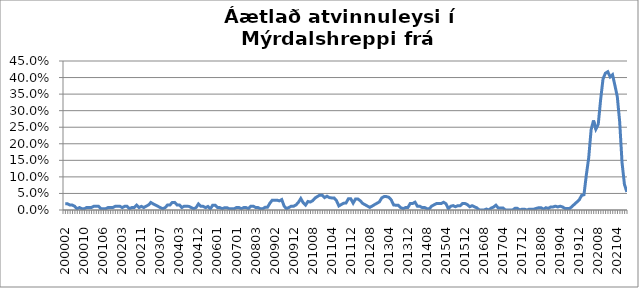
| Category | Series 0 |
|---|---|
| 200002 | 0.019 |
| 200003 | 0.019 |
| 200004 | 0.015 |
| 200005 | 0.015 |
| 200006 | 0.011 |
| 200007 | 0.004 |
| 200008 | 0.007 |
| 200009 | 0.004 |
| 200010 | 0.004 |
| 200011 | 0.007 |
| 200012 | 0.007 |
| 200101 | 0.007 |
| 200102 | 0.011 |
| 200103 | 0.011 |
| 200104 | 0.011 |
| 200105 | 0.004 |
| 200106 | 0.004 |
| 200108 | 0.004 |
| 200109 | 0.007 |
| 200110 | 0.007 |
| 200111 | 0.007 |
| 200112 | 0.011 |
| 200201 | 0.011 |
| 200202 | 0.011 |
| 200203 | 0.007 |
| 200204 | 0.011 |
| 200205 | 0.011 |
| 200206 | 0.004 |
| 200207 | 0.007 |
| 200208 | 0.007 |
| 200209 | 0.015 |
| 200210 | 0.007 |
| 200211 | 0.011 |
| 200212 | 0.007 |
| 200301 | 0.011 |
| 200302 | 0.015 |
| 200303 | 0.023 |
| 200304 | 0.018 |
| 200305 | 0.015 |
| 200306 | 0.011 |
| 200307 | 0.007 |
| 200308 | 0.004 |
| 200309 | 0.007 |
| 200310 | 0.015 |
| 200311 | 0.015 |
| 200312 | 0.023 |
| 200401 | 0.023 |
| 200402 | 0.015 |
| 200403 | 0.015 |
| 200404 | 0.008 |
| 200405 | 0.011 |
| 200406 | 0.011 |
| 200407 | 0.011 |
| 200408 | 0.007 |
| 200410 | 0.004 |
| 200411 | 0.007 |
| 200412 | 0.018 |
| 200501 | 0.011 |
| 200502 | 0.011 |
| 200508 | 0.007 |
| 200509 | 0.011 |
| 200510 | 0.004 |
| 200511 | 0.015 |
| 200512 | 0.015 |
| 200601 | 0.007 |
| 200602 | 0.007 |
| 200603 | 0.004 |
| 200604 | 0.007 |
| 200605 | 0.007 |
| 200606 | 0.003 |
| 200607 | 0.004 |
| 200612 | 0.004 |
| 200701 | 0.008 |
| 200702 | 0.008 |
| 200703 | 0.004 |
| 200704 | 0.007 |
| 200705 | 0.007 |
| 200712 | 0.004 |
| 200801 | 0.012 |
| 200802 | 0.012 |
| 200803 | 0.008 |
| 200804 | 0.007 |
| 200805 | 0.004 |
| 200806 | 0.004 |
| 200810 | 0.008 |
| 200811 | 0.008 |
| 200812 | 0.02 |
| 200901 | 0.03 |
| 200902 | 0.03 |
| 200903 | 0.03 |
| 200904 | 0.028 |
| 200905 | 0.031 |
| 200906 | 0.012 |
| 200907 | 0.004 |
| 200910 | 0.008 |
| 200911 | 0.011 |
| 200912 | 0.011 |
| 201001 | 0.015 |
| 201002 | 0.023 |
| 201003 | 0.035 |
| 201004 | 0.022 |
| 201005 | 0.015 |
| 201006 | 0.026 |
| 201007 | 0.024 |
| 201008 | 0.028 |
| 201009 | 0.036 |
| 201010 | 0.041 |
| 201011 | 0.045 |
| 201012 | 0.045 |
| 201101 | 0.038 |
| 201102 | 0.042 |
| 201103 | 0.038 |
| 201104 | 0.036 |
| 201105 | 0.036 |
| 201106 | 0.028 |
| 201107 | 0.012 |
| 201108 | 0.016 |
| 201109 | 0.02 |
| 201110 | 0.021 |
| 201111 | 0.034 |
| 201112 | 0.034 |
| 201201 | 0.021 |
| 201202 | 0.033 |
| 201203 | 0.033 |
| 201204 | 0.028 |
| 201205 | 0.02 |
| 201206 | 0.016 |
| 201207 | 0.012 |
| 201208 | 0.008 |
| 201209 | 0.012 |
| 201210 | 0.016 |
| 201211 | 0.02 |
| 201212 | 0.024 |
| 201301 | 0.036 |
| 201302 | 0.04 |
| 201303 | 0.04 |
| 201304 | 0.038 |
| 201305 | 0.031 |
| 201306 | 0.015 |
| 201307 | 0.014 |
| 201308 | 0.014 |
| 201309 | 0.007 |
| 201310 | 0.004 |
| 201311 | 0.007 |
| 201312 | 0.007 |
| 201401 | 0.02 |
| 201402 | 0.02 |
| 201403 | 0.024 |
| 201404 | 0.011 |
| 201405 | 0.011 |
| 201406 | 0.008 |
| 201407 | 0.008 |
| 201408 | 0.004 |
| 201409 | 0.004 |
| 201410 | 0.012 |
| 201411 | 0.016 |
| 201412 | 0.02 |
| 201501 | 0.019 |
| 201502 | 0.019 |
| 201503 | 0.023 |
| 201504 | 0.019 |
| 201505 | 0.004 |
| 201506 | 0.011 |
| 201507 | 0.013 |
| 201508 | 0.01 |
| 201509 | 0.013 |
| 201510 | 0.013 |
| 201511 | 0.02 |
| 201512 | 0.02 |
| 201601 | 0.016 |
| 201602 | 0.01 |
| 201603 | 0.013 |
| 201604 | 0.01 |
| 201605 | 0.006 |
| 201606 | 0 |
| 201607 | 0 |
| 201608 | 0 |
| 201609 | 0.003 |
| 201610 | 0 |
| 201611 | 0.006 |
| 201612 | 0.009 |
| 201701 | 0.015 |
| 201702 | 0.006 |
| 201703 | 0.006 |
| 201704 | 0.006 |
| 201705 | 0 |
| 201706 | 0 |
| 201707 | 0 |
| 201708 | 0 |
| 201709 | 0.005 |
| 201710 | 0.005 |
| 201711 | 0 |
| 201712 | 0.003 |
| 201801 | 0.003 |
| 201802 | 0 |
| 201803 | 0.003 |
| 201804 | 0.003 |
| 201805 | 0.003 |
| 201806 | 0.005 |
| 201807 | 0.007 |
| 201808 | 0.007 |
| 201809 | 0.002 |
| 201810 | 0.007 |
| 201811 | 0.005 |
| 201812 | 0.009 |
| 201901 | 0.009 |
| 201902 | 0.011 |
| 201903 | 0.009 |
| 201904 | 0.011 |
| 201905 | 0.009 |
| 201906 | 0.005 |
| 201907 | 0.004 |
| 201908 | 0.004 |
| 201909 | 0.011 |
| 201910 | 0.017 |
| 201911 | 0.024 |
| 201912 | 0.03 |
| 202001 | 0.044 |
| 202002 | 0.046 |
| 202003*** | 0.106 |
| 202004 | 0.159 |
| 202005 | 0.242 |
| 202006 | 0.27 |
| 202007 | 0.244 |
| 202008 | 0.259 |
| 202009 | 0.333 |
| 202010 | 0.396 |
| 202011 | 0.413 |
| 202012 | 0.418 |
| 202101 | 0.402 |
| 202102 | 0.409 |
| 202103 | 0.376 |
| 202104 | 0.342 |
| 202105 | 0.267 |
| 202106 | 0.143 |
| 202107 | 0.078 |
| 202108 | 0.055 |